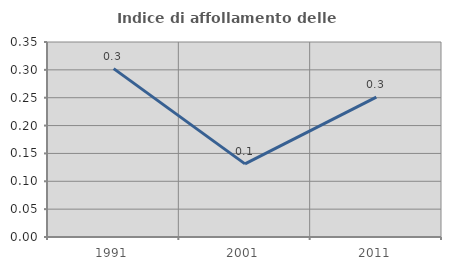
| Category | Indice di affollamento delle abitazioni  |
|---|---|
| 1991.0 | 0.302 |
| 2001.0 | 0.131 |
| 2011.0 | 0.251 |